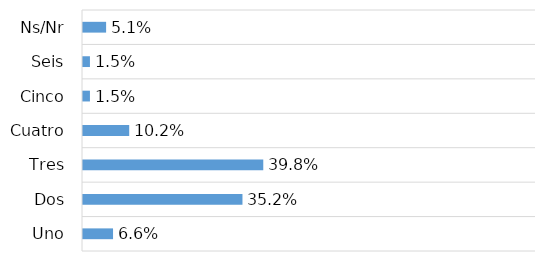
| Category | Series 0 |
|---|---|
| Uno | 0.066 |
| Dos | 0.352 |
| Tres | 0.398 |
| Cuatro | 0.102 |
| Cinco | 0.015 |
| Seis | 0.015 |
| Ns/Nr | 0.051 |